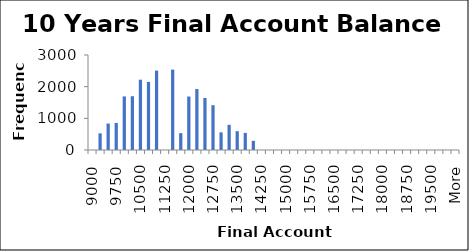
| Category | Frequency |
|---|---|
| 9000.0 | 0 |
| 9250.0 | 527 |
| 9500.0 | 836 |
| 9750.0 | 854 |
| 10000.0 | 1691 |
| 10250.0 | 1698 |
| 10500.0 | 2220 |
| 10750.0 | 2150 |
| 11000.0 | 2507 |
| 11250.0 | 0 |
| 11500.0 | 2539 |
| 11750.0 | 532 |
| 12000.0 | 1689 |
| 12250.0 | 1926 |
| 12500.0 | 1643 |
| 12750.0 | 1414 |
| 13000.0 | 557 |
| 13250.0 | 795 |
| 13500.0 | 594 |
| 13750.0 | 539 |
| 14000.0 | 289 |
| 14250.0 | 0 |
| 14500.0 | 0 |
| 14750.0 | 0 |
| 15000.0 | 0 |
| 15250.0 | 0 |
| 15500.0 | 0 |
| 15750.0 | 0 |
| 16000.0 | 0 |
| 16250.0 | 0 |
| 16500.0 | 0 |
| 16750.0 | 0 |
| 17000.0 | 0 |
| 17250.0 | 0 |
| 17500.0 | 0 |
| 17750.0 | 0 |
| 18000.0 | 0 |
| 18250.0 | 0 |
| 18500.0 | 0 |
| 18750.0 | 0 |
| 19000.0 | 0 |
| 19250.0 | 0 |
| 19500.0 | 0 |
| 19750.0 | 0 |
| 20000.0 | 0 |
| More | 0 |